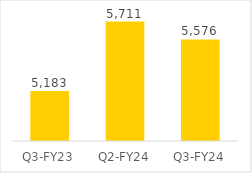
| Category | Series 0 |
|---|---|
| Q3-FY23 | 5182.568 |
| Q2-FY24 | 5711.493 |
| Q3-FY24 | 5575.635 |